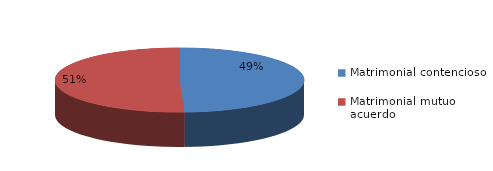
| Category | Series 0 |
|---|---|
| 0 | 468 |
| 1 | 480 |